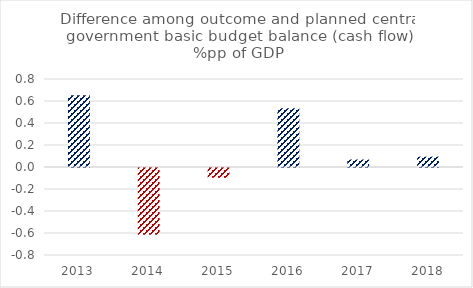
| Category | Series 0 |
|---|---|
| 2013.0 | 0.652 |
| 2014.0 | -0.607 |
| 2015.0 | -0.09 |
| 2016.0 | 0.534 |
| 2017.0 | 0.068 |
| 2018.0 | 0.094 |